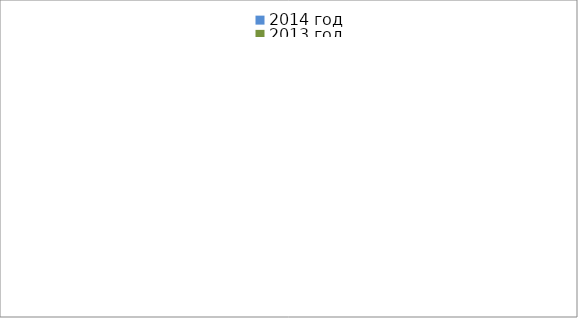
| Category | 2014 год | 2013 год |
|---|---|---|
|  - поджог | 15 | 25 |
|  - неосторожное обращение с огнём | 30 | 42 |
|  - НПТЭ электрооборудования | 16 | 20 |
|  - НПУ и Э печей | 49 | 38 |
|  - НПУ и Э транспортных средств | 48 | 49 |
|   -Шалость с огнем детей | 0 | 3 |
|  -НППБ при эксплуатации эл.приборов | 16 | 21 |
|  - курение | 17 | 9 |
| - прочие | 70 | 65 |
| - не установленные причины | 7 | 1 |